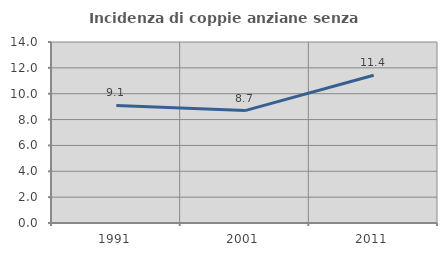
| Category | Incidenza di coppie anziane senza figli  |
|---|---|
| 1991.0 | 9.091 |
| 2001.0 | 8.696 |
| 2011.0 | 11.429 |